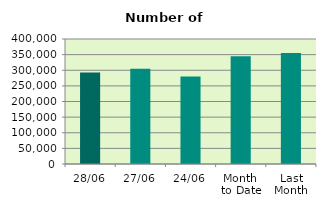
| Category | Series 0 |
|---|---|
| 28/06 | 292842 |
| 27/06 | 304952 |
| 24/06 | 280210 |
| Month 
to Date | 344453.579 |
| Last
Month | 355289.273 |